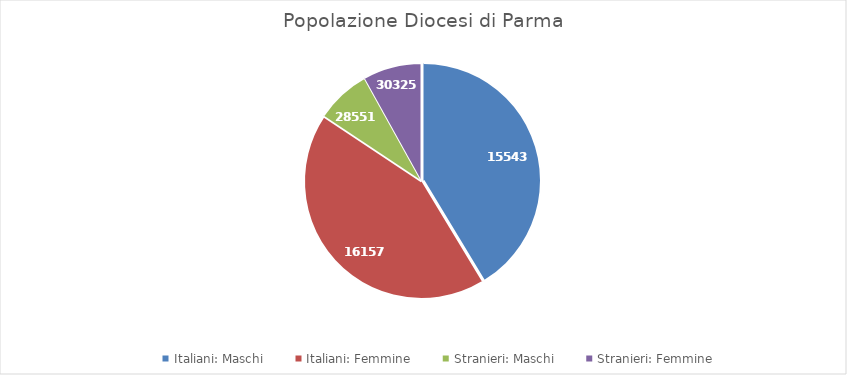
| Category | Series 0 |
|---|---|
| Italiani: Maschi | 155439 |
| Italiani: Femmine | 161570 |
| Stranieri: Maschi | 28551 |
| Stranieri: Femmine | 30325 |